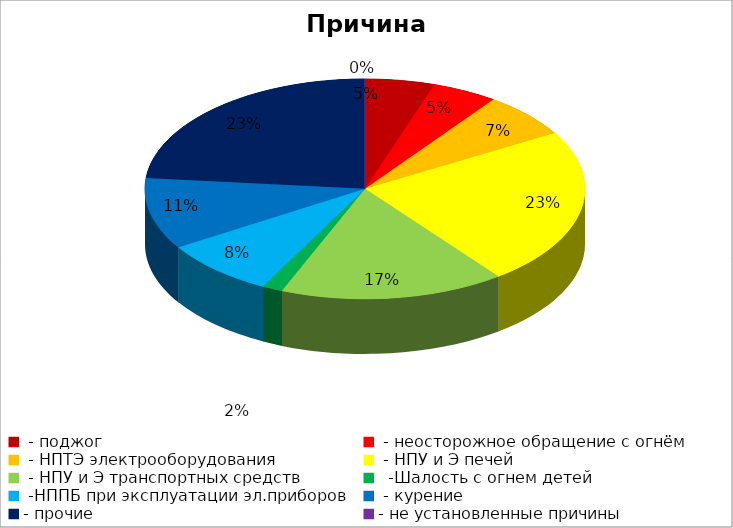
| Category | Причина пожара |
|---|---|
|  - поджог | 17 |
|  - неосторожное обращение с огнём | 16 |
|  - НПТЭ электрооборудования | 22 |
|  - НПУ и Э печей | 77 |
|  - НПУ и Э транспортных средств | 55 |
|   -Шалость с огнем детей | 5 |
|  -НППБ при эксплуатации эл.приборов | 28 |
|  - курение | 35 |
| - прочие | 78 |
| - не установленные причины | 0 |